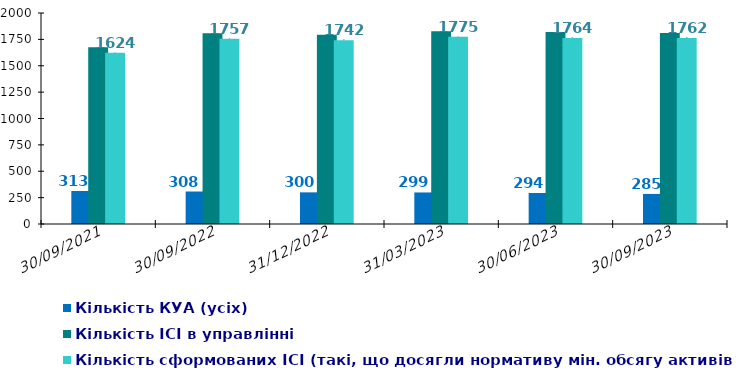
| Category | Кількість КУА (усіх) | Кількість КУА з ІСІ в управлінні | Кількість ІСІ в управлінні  | Кількість сформованих ІСІ (такі, що досягли нормативу мін. обсягу активів)  |
|---|---|---|---|---|
| 30/09/2021 | 313 |  | 1676 | 1624 |
| 30/09/2022 | 308 |  | 1807 | 1757 |
| 31/12/2022 | 300 |  | 1795 | 1742 |
| 31/03/2023 | 299 |  | 1828 | 1775 |
| 30/06/2023 | 294 |  | 1819 | 1764 |
| 30/09/2023 | 285 |  | 1811 | 1762 |